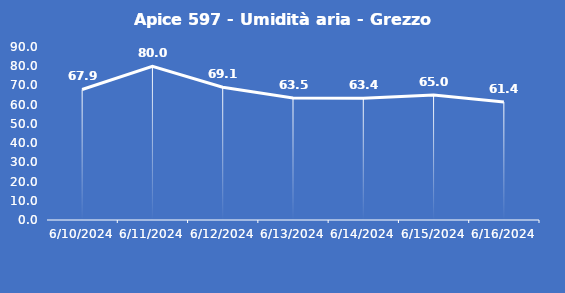
| Category | Apice 597 - Umidità aria - Grezzo (%) |
|---|---|
| 6/10/24 | 67.9 |
| 6/11/24 | 80 |
| 6/12/24 | 69.1 |
| 6/13/24 | 63.5 |
| 6/14/24 | 63.4 |
| 6/15/24 | 65 |
| 6/16/24 | 61.4 |